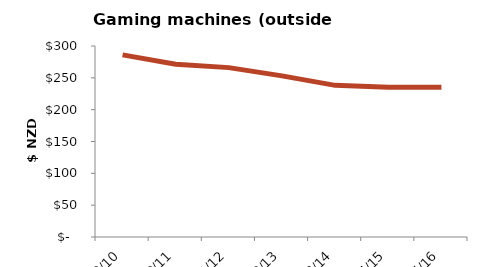
| Category | Inflation adjusted expenditure per capita |
|---|---|
| 2009/10 | 286.086 |
| 2010/11 | 271.33 |
| 2011/12 | 266.044 |
| 2012/13 | 253.12 |
| 2013/14 | 238.191 |
| 2014/15 | 235.083 |
| 2015/16 | 235.333 |